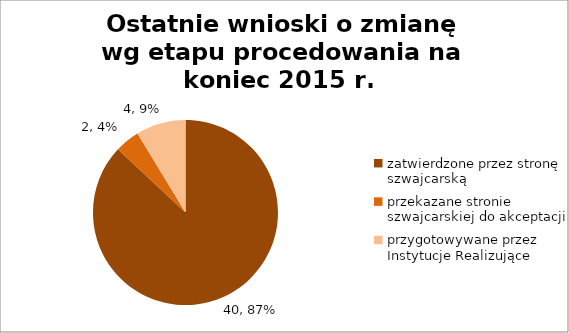
| Category | Series 0 |
|---|---|
| zatwierdzone przez stronę szwajcarską | 40 |
| przekazane stronie szwajcarskiej do akceptacji  | 2 |
| przygotowywane przez Instytucje Realizujące | 4 |